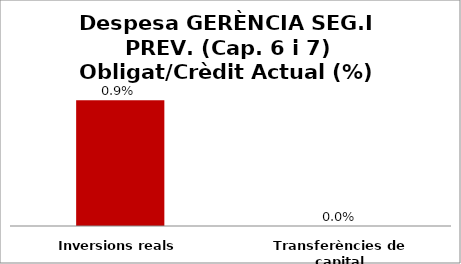
| Category | Series 0 |
|---|---|
| Inversions reals | 0.009 |
| Transferències de capital | 0 |